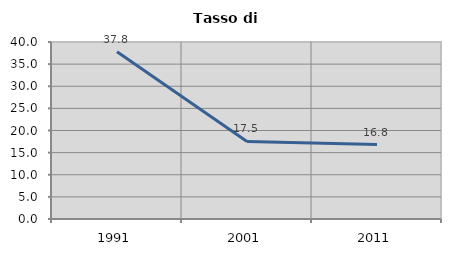
| Category | Tasso di disoccupazione   |
|---|---|
| 1991.0 | 37.774 |
| 2001.0 | 17.538 |
| 2011.0 | 16.813 |